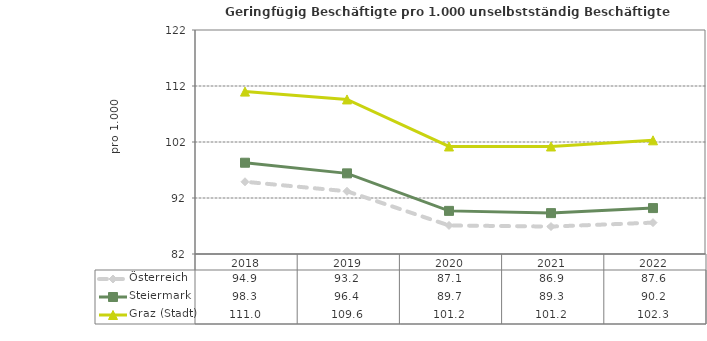
| Category | Österreich | Steiermark | Graz (Stadt) |
|---|---|---|---|
| 2022.0 | 87.6 | 90.2 | 102.3 |
| 2021.0 | 86.9 | 89.3 | 101.2 |
| 2020.0 | 87.1 | 89.7 | 101.2 |
| 2019.0 | 93.2 | 96.4 | 109.6 |
| 2018.0 | 94.9 | 98.3 | 111 |